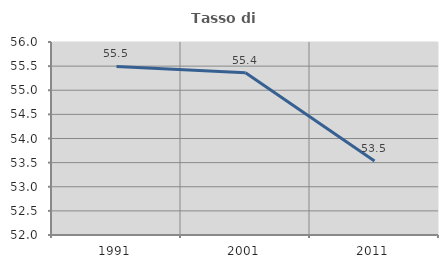
| Category | Tasso di occupazione   |
|---|---|
| 1991.0 | 55.493 |
| 2001.0 | 55.362 |
| 2011.0 | 53.535 |